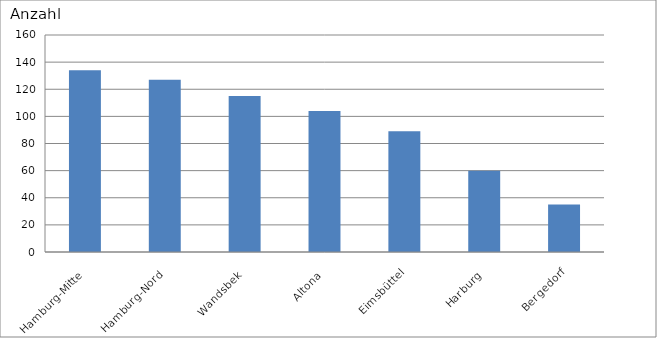
| Category | Hamburg-Mitte Hamburg-Nord Wandsbek Altona Eimsbüttel Harburg Bergedorf |
|---|---|
| Hamburg-Mitte | 134 |
| Hamburg-Nord | 127 |
| Wandsbek | 115 |
| Altona | 104 |
| Eimsbüttel | 89 |
| Harburg | 60 |
| Bergedorf | 35 |